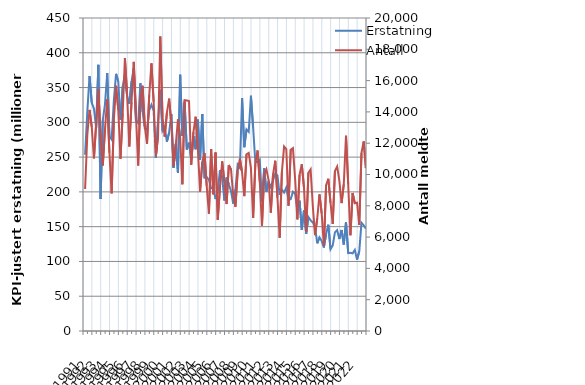
| Category | Erstatning |
|---|---|
| 1991.0 | 253.469 |
| nan | 315.36 |
| nan | 366.519 |
| nan | 328.269 |
| 1992.0 | 319.552 |
| nan | 291.981 |
| nan | 382.641 |
| nan | 189.775 |
| 1993.0 | 302.742 |
| nan | 326.193 |
| nan | 370.855 |
| nan | 280.025 |
| 1994.0 | 275.259 |
| nan | 331.438 |
| nan | 369.692 |
| nan | 358.663 |
| 1995.0 | 303.678 |
| nan | 351.299 |
| nan | 368.914 |
| nan | 337.816 |
| 1996.0 | 326.588 |
| nan | 358.519 |
| nan | 378.266 |
| nan | 302.415 |
| 1997.0 | 298.989 |
| nan | 356.113 |
| nan | 315.206 |
| nan | 291.396 |
| 1998.0 | 289.223 |
| nan | 317.273 |
| nan | 325.337 |
| nan | 316.584 |
| 1999.0 | 248.708 |
| nan | 301.782 |
| nan | 346.828 |
| nan | 287.664 |
| 2000.0 | 293.228 |
| nan | 271.936 |
| nan | 285.248 |
| nan | 311.846 |
| 2001.0 | 234.505 |
| nan | 268.968 |
| nan | 227.131 |
| nan | 368.386 |
| 2002.0 | 280.478 |
| nan | 328.826 |
| nan | 260.77 |
| nan | 270.739 |
| 2003.0 | 247.365 |
| nan | 280.296 |
| nan | 261.363 |
| nan | 303.899 |
| 2004.0 | 246.119 |
| nan | 312.001 |
| nan | 220.435 |
| nan | 221.355 |
| 2005.0 | 217.579 |
| nan | 205.064 |
| nan | 205.915 |
| nan | 189.628 |
| 2006.0 | 200.078 |
| nan | 231.376 |
| nan | 220.674 |
| nan | 187.581 |
| 2007.0 | 220.694 |
| nan | 210.821 |
| nan | 201.064 |
| nan | 183.119 |
| 2008.0 | 203.451 |
| nan | 239.218 |
| nan | 234.438 |
| nan | 334.908 |
| 2009.0 | 264.21 |
| nan | 289.974 |
| nan | 286.344 |
| nan | 338.202 |
| 2010.0 | 292.603 |
| nan | 242.276 |
| nan | 243.27 |
| nan | 246.171 |
| 2011.0 | 186.198 |
| nan | 233.898 |
| nan | 200.278 |
| nan | 214.975 |
| 2012.0 | 206.705 |
| nan | 216.668 |
| nan | 226.437 |
| nan | 223.463 |
| 2013.0 | 195.495 |
| nan | 203.199 |
| nan | 199.023 |
| nan | 206.2 |
| 2014.0 | 188.402 |
| nan | 189.607 |
| nan | 200.172 |
| nan | 197.056 |
| 2015.0 | 173.901 |
| nan | 187.368 |
| nan | 145.441 |
| nan | 173.337 |
| 2016.0 | 139.594 |
| nan | 163.833 |
| nan | 159.014 |
| nan | 156.137 |
| 2017.0 | 149.352 |
| nan | 126.055 |
| nan | 134.611 |
| nan | 129.438 |
| 2018.0 | 120.035 |
| nan | 139.312 |
| nan | 152.844 |
| nan | 117.524 |
| 2019.0 | 123.081 |
| nan | 141.817 |
| nan | 144.981 |
| nan | 132.183 |
| 2020.0 | 145.263 |
| nan | 124.327 |
| nan | 156.564 |
| nan | 111.962 |
| 2021.0 | 112.429 |
| nan | 111.632 |
| nan | 116.581 |
| nan | 102.588 |
| 2022.0 | 114.516 |
| nan | 155.702 |
| nan | 152.016 |
| nan | 147.103 |